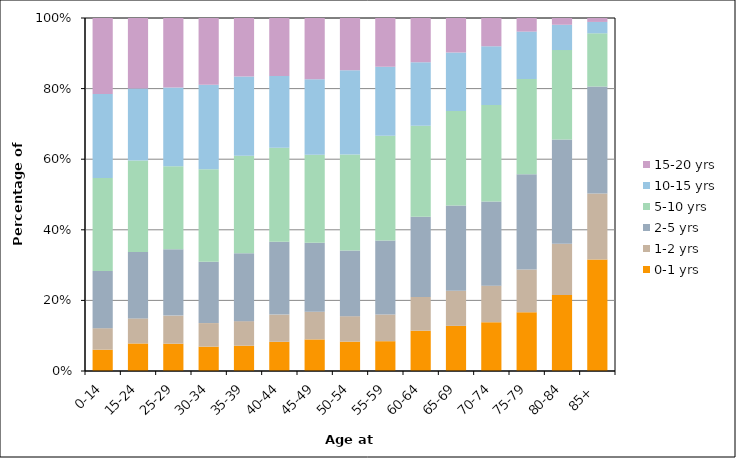
| Category | 0-1 yrs | 1-2 yrs | 2-5 yrs | 5-10 yrs | 10-15 yrs | 15-20 yrs |
|---|---|---|---|---|---|---|
| 0-14 | 593 | 598 | 1589 | 2589 | 2334 | 2116 |
| 15-24 | 993 | 903 | 2394 | 3294 | 2595 | 2544 |
| 25-29 | 1326 | 1362 | 3227 | 4018 | 3826 | 3374 |
| 30-34 | 1946 | 1883 | 4894 | 7404 | 6735 | 5341 |
| 35-39 | 3172 | 3082 | 8522 | 12205 | 9956 | 7327 |
| 40-44 | 5537 | 5161 | 13801 | 17814 | 13605 | 11011 |
| 45-49 | 8288 | 7277 | 18107 | 23084 | 19771 | 16099 |
| 50-54 | 10177 | 8818 | 22741 | 33270 | 29188 | 18106 |
| 55-59 | 10885 | 9750 | 27052 | 38227 | 25202 | 17784 |
| 60-64 | 15649 | 13079 | 31119 | 35320 | 24581 | 17192 |
| 65-69 | 14997 | 11692 | 28322 | 31407 | 19480 | 11472 |
| 70-74 | 13155 | 9863 | 22681 | 26025 | 15856 | 7625 |
| 75-79 | 12354 | 9022 | 19998 | 20045 | 9982 | 2860 |
| 80-84 | 10044 | 6749 | 13743 | 11813 | 3337 | 892 |
| 85+ | 9133 | 5387 | 8760 | 4355 | 930 | 322 |